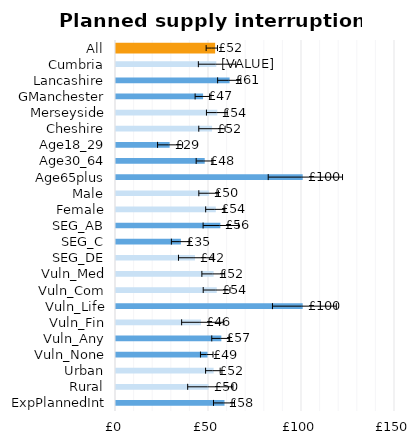
| Category | Series 0 |
|---|---|
| All | 51.962 |
| Cumbria | 53.929 |
| Lancashire | 61.074 |
| GManchester | 46.819 |
| Merseyside | 54.46 |
| Cheshire | 51.64 |
| Age18_29 | 28.831 |
| Age30_64 | 47.7 |
| Age65plus | 100.378 |
| Male | 50.062 |
| Female | 53.651 |
| SEG_AB | 56.109 |
| SEG_C | 34.885 |
| SEG_DE | 42.447 |
| Vuln_Med | 52.479 |
| Vuln_Com | 54.153 |
| Vuln_Life | 100.372 |
| Vuln_Fin | 45.668 |
| Vuln_Any | 56.63 |
| Vuln_None | 49.203 |
| Urban | 52.474 |
| Rural | 49.774 |
| ExpPlannedInt | 58.328 |